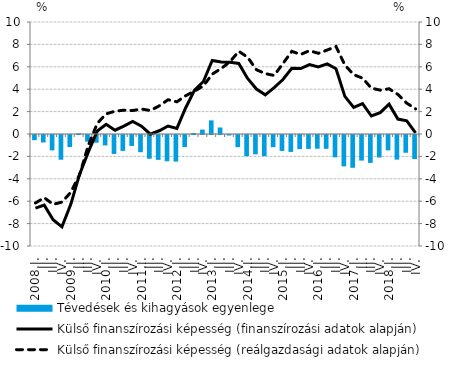
| Category | Tévedések és kihagyások egyenlege |
|---|---|
| 2008.I. | -0.462 |
| II. | -0.666 |
| III. | -1.371 |
| IV. | -2.208 |
| 2009.I. | -1.075 |
| II. | 0.056 |
| III. | -0.595 |
| IV. | -0.688 |
| 2010.I. | -0.929 |
| II. | -1.692 |
| III. | -1.42 |
| IV. | -0.975 |
| 2011.I. | -1.533 |
| II. | -2.118 |
| III. | -2.221 |
| IV. | -2.347 |
| 2012.I. | -2.376 |
| II. | -1.077 |
| III. | 0.091 |
| IV. | 0.393 |
| 2013.I. | 1.215 |
| II. | 0.583 |
| III. | -0.044 |
| IV. | -1.086 |
| 2014.I. | -1.893 |
| II. | -1.724 |
| III. | -1.892 |
| IV. | -1.087 |
| 2015.I. | -1.425 |
| II. | -1.511 |
| III. | -1.258 |
| IV. | -1.242 |
| 2016.I. | -1.224 |
| II. | -1.236 |
| III. | -1.992 |
| IV. | -2.799 |
| 2017.I. | -2.928 |
| II. | -2.286 |
| III. | -2.491 |
| IV. | -2.011 |
| 2018.I. | -1.372 |
| II. | -2.197 |
| III. | -1.586 |
| IV. | -2.146 |